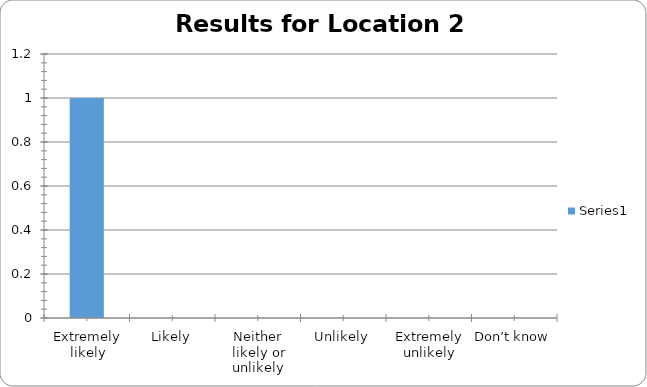
| Category | Series 0 |
|---|---|
| Extremely likely | 1 |
| Likely | 0 |
| Neither likely or unlikely | 0 |
| Unlikely | 0 |
| Extremely unlikely | 0 |
| Don’t know | 0 |